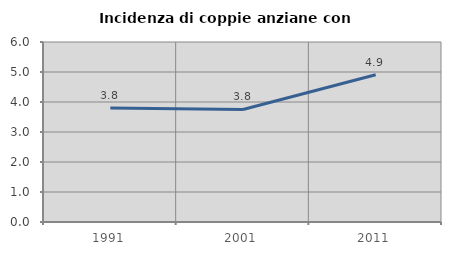
| Category | Incidenza di coppie anziane con figli |
|---|---|
| 1991.0 | 3.8 |
| 2001.0 | 3.751 |
| 2011.0 | 4.906 |